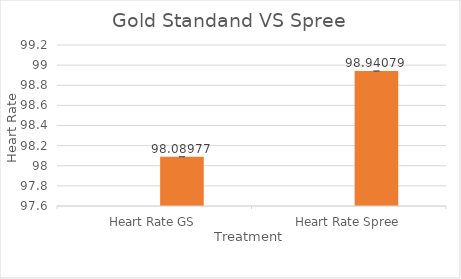
| Category | Series 0 | Series 1 |
|---|---|---|
| Heart Rate GS |  | 98.09 |
| Heart Rate Spree |  | 98.941 |